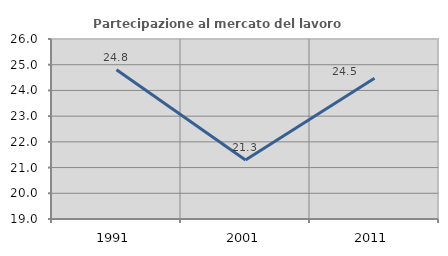
| Category | Partecipazione al mercato del lavoro  femminile |
|---|---|
| 1991.0 | 24.805 |
| 2001.0 | 21.291 |
| 2011.0 | 24.477 |